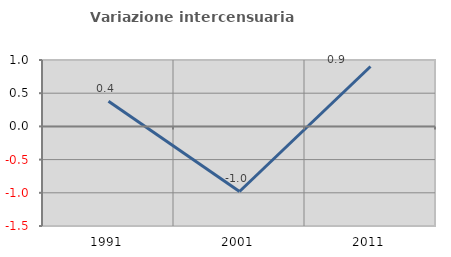
| Category | Variazione intercensuaria annua |
|---|---|
| 1991.0 | 0.378 |
| 2001.0 | -0.98 |
| 2011.0 | 0.903 |